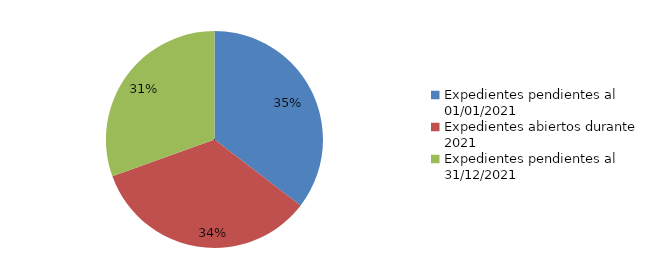
| Category | Series 0 |
|---|---|
| Expedientes pendientes al 01/01/2021 | 108 |
| Expedientes abiertos durante 2021 | 104 |
| Expedientes pendientes al 31/12/2021 | 93 |